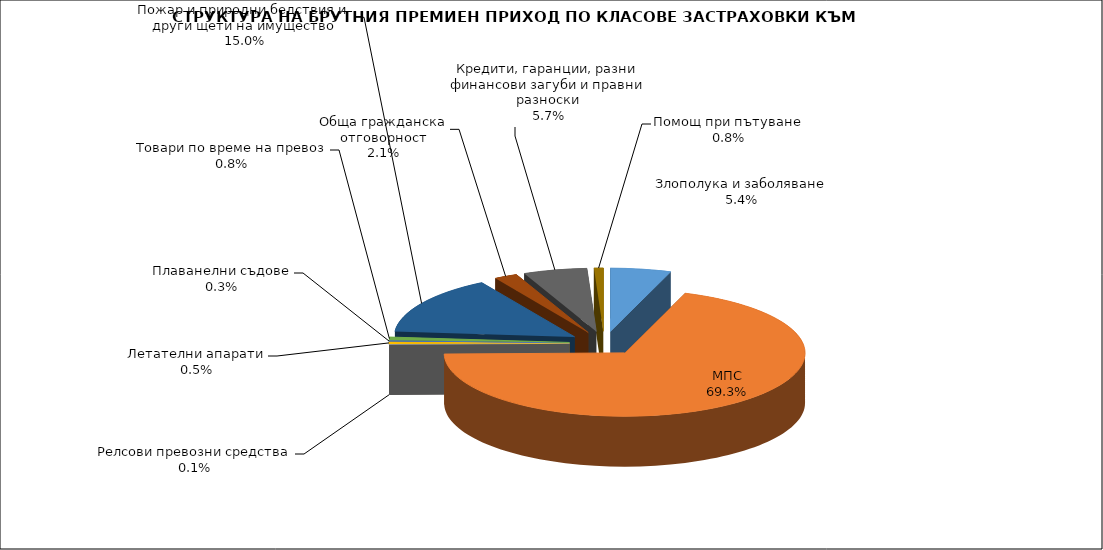
| Category | Злополука и заболяване |
|---|---|
| Злополука и заболяване | 0.054 |
| МПС | 0.693 |
| Релсови превозни средства | 0.001 |
| Летателни апарати | 0.005 |
| Плаванелни съдове | 0.003 |
| Товари по време на превоз | 0.008 |
| Пожар и природни бедствия и други щети на имущество | 0.15 |
| Обща гражданска отговорност | 0.021 |
| Кредити, гаранции, разни финансови загуби и правни разноски | 0.057 |
| Помощ при пътуване | 0.008 |